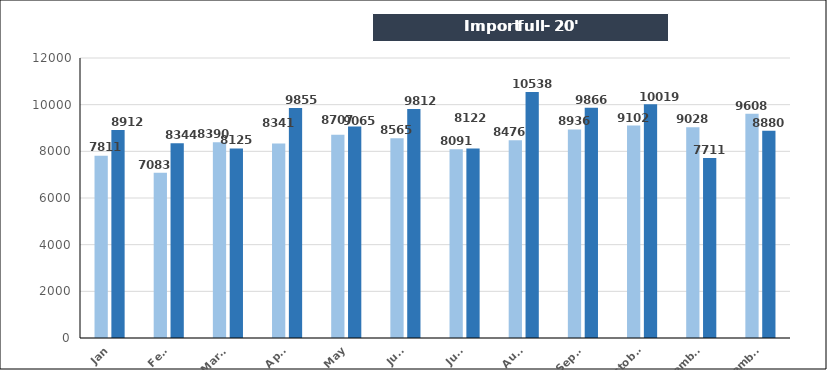
| Category | Import full - 20' |
|---|---|
| Jan | 8912 |
| Feb. | 8344 |
| March | 8125 |
| April | 9855 |
| May | 9065 |
| June | 9812 |
| July | 8122 |
| Aug. | 10538 |
| Sept. | 9866 |
| October | 10019 |
| November | 7711 |
| December | 8880 |